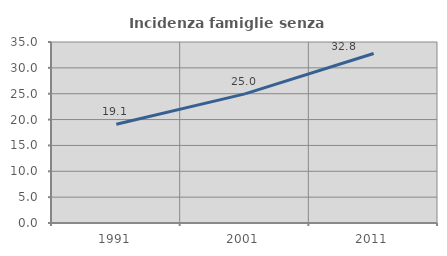
| Category | Incidenza famiglie senza nuclei |
|---|---|
| 1991.0 | 19.09 |
| 2001.0 | 24.968 |
| 2011.0 | 32.779 |